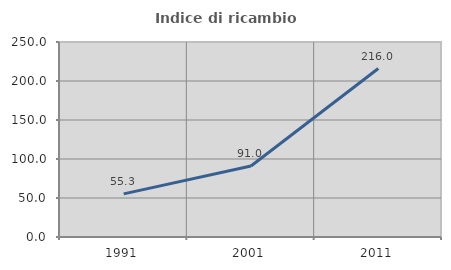
| Category | Indice di ricambio occupazionale  |
|---|---|
| 1991.0 | 55.272 |
| 2001.0 | 91.026 |
| 2011.0 | 216 |